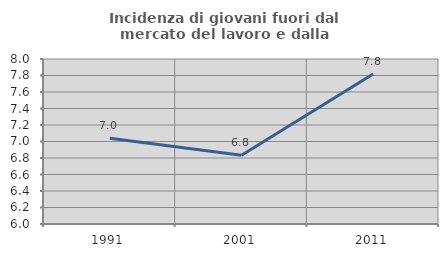
| Category | Incidenza di giovani fuori dal mercato del lavoro e dalla formazione  |
|---|---|
| 1991.0 | 7.038 |
| 2001.0 | 6.834 |
| 2011.0 | 7.818 |